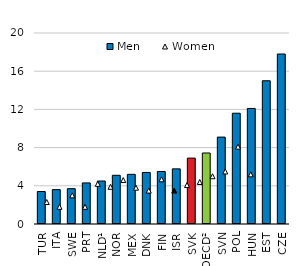
| Category | Men |
|---|---|
| TUR | 3.4 |
| ITA | 3.6 |
| SWE | 3.7 |
| PRT | 4.3 |
| NLD¹ | 4.5 |
| NOR | 5.1 |
| MEX | 5.2 |
| DNK | 5.4 |
| FIN | 5.5 |
| ISR | 5.774 |
| SVK | 6.9 |
| OECD² | 7.436 |
| SVN | 9.1 |
| POL | 11.6 |
| HUN | 12.1 |
| EST | 15 |
| CZE | 17.8 |